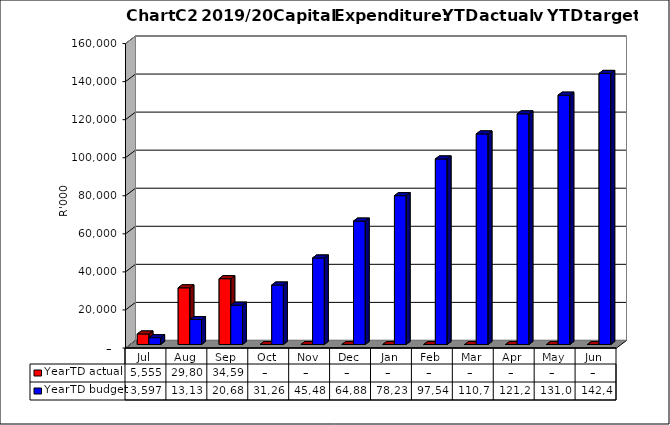
| Category | YearTD actual | YearTD budget |
|---|---|---|
| Jul | 5554740.23 | 3597000 |
| Aug | 29801091.39 | 13137000 |
| Sep | 34591330.1 | 20682000 |
| Oct | 0 | 31265000 |
| Nov | 0 | 45485000 |
| Dec | 0 | 64881000 |
| Jan | 0 | 78237000 |
| Feb | 0 | 97546000 |
| Mar | 0 | 110701000 |
| Apr | 0 | 121248000 |
| May | 0 | 131069000 |
| Jun | 0 | 142486000 |